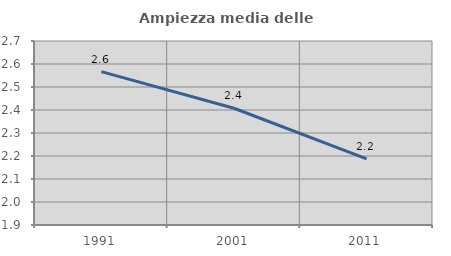
| Category | Ampiezza media delle famiglie |
|---|---|
| 1991.0 | 2.567 |
| 2001.0 | 2.408 |
| 2011.0 | 2.187 |